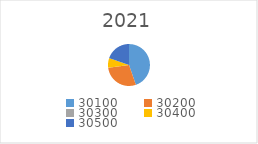
| Category | Series 0 |
|---|---|
| 30100.0 | 984284.55 |
| 30200.0 | 620765.32 |
| 30300.0 | 1156.31 |
| 30400.0 | 162947.06 |
| 30500.0 | 433582.9 |